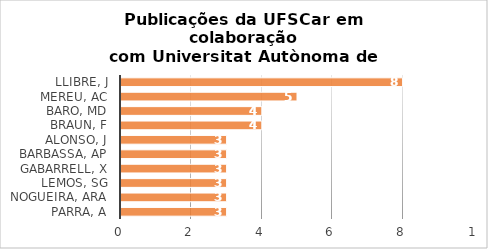
| Category | # Records |
|---|---|
| LLIBRE, J | 8 |
| MEREU, AC | 5 |
| BARO, MD | 4 |
| BRAUN, F | 4 |
| ALONSO, J | 3 |
| BARBASSA, AP | 3 |
| GABARRELL, X | 3 |
| LEMOS, SG | 3 |
| NOGUEIRA, ARA | 3 |
| PARRA, A | 3 |